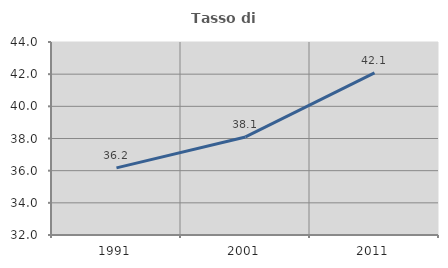
| Category | Tasso di occupazione   |
|---|---|
| 1991.0 | 36.173 |
| 2001.0 | 38.096 |
| 2011.0 | 42.083 |